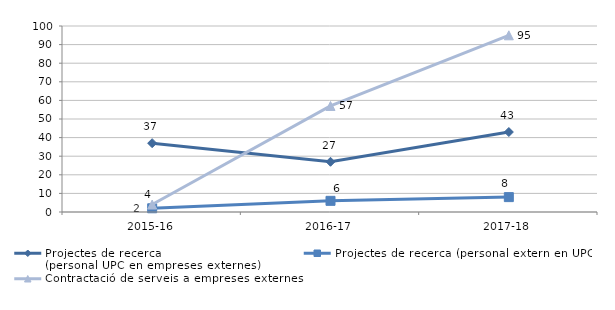
| Category | Projectes de recerca 
(personal UPC en empreses externes) | Projectes de recerca (personal extern en UPC) | Contractació de serveis a empreses externes |
|---|---|---|---|
| 2015-16 | 37 | 2 | 4 |
| 2016-17 | 27 | 6 | 57 |
| 2017-18 | 43 | 8 | 95 |